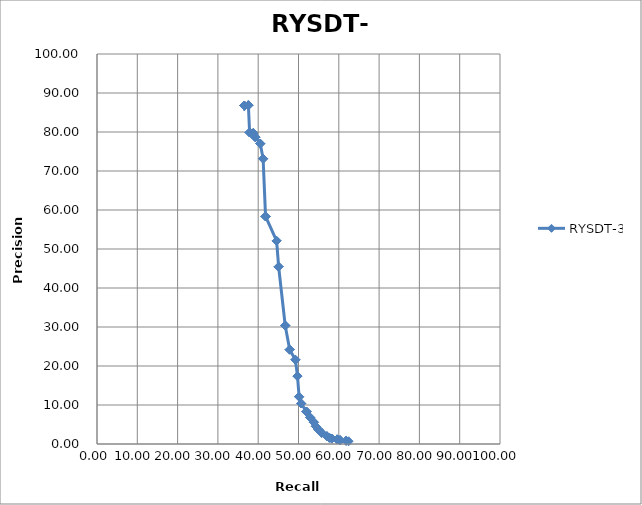
| Category | RYSDT-3 |
|---|---|
| 36.548 | 86.747 |
| 36.548 | 86.747 |
| 36.548 | 86.747 |
| 36.548 | 86.747 |
| 36.548 | 86.747 |
| 36.548 | 86.747 |
| 36.548 | 86.747 |
| 36.548 | 86.747 |
| 36.548 | 86.747 |
| 36.548 | 86.747 |
| 37.563 | 86.854 |
| 37.563 | 86.854 |
| 37.563 | 86.854 |
| 37.563 | 86.854 |
| 37.868 | 79.872 |
| 37.868 | 79.872 |
| 37.868 | 79.872 |
| 38.782 | 79.749 |
| 38.782 | 79.749 |
| 38.782 | 79.749 |
| 39.289 | 78.659 |
| 39.289 | 78.659 |
| 39.289 | 78.659 |
| 39.289 | 78.659 |
| 40.508 | 77.027 |
| 40.508 | 77.027 |
| 40.508 | 77.027 |
| 41.218 | 73.153 |
| 41.218 | 73.153 |
| 41.218 | 73.153 |
| 41.827 | 58.357 |
| 41.827 | 58.357 |
| 41.827 | 58.357 |
| 41.827 | 58.357 |
| 44.569 | 52.076 |
| 44.569 | 52.076 |
| 44.569 | 52.076 |
| 45.076 | 45.445 |
| 45.076 | 45.445 |
| 45.076 | 45.445 |
| 46.701 | 30.383 |
| 46.701 | 30.383 |
| 46.701 | 30.383 |
| 46.701 | 30.383 |
| 47.817 | 24.191 |
| 47.817 | 24.191 |
| 47.817 | 24.191 |
| 49.239 | 21.594 |
| 49.239 | 21.594 |
| 49.239 | 21.594 |
| 49.746 | 17.419 |
| 49.746 | 17.419 |
| 49.746 | 17.419 |
| 49.746 | 17.419 |
| 50.152 | 12.12 |
| 50.152 | 12.12 |
| 50.152 | 12.12 |
| 50.66 | 10.389 |
| 50.66 | 10.389 |
| 50.66 | 10.389 |
| 51.98 | 8.302 |
| 51.98 | 8.302 |
| 51.98 | 8.302 |
| 51.98 | 8.302 |
| 52.893 | 6.792 |
| 52.893 | 6.792 |
| 52.893 | 6.792 |
| 53.807 | 5.595 |
| 53.807 | 5.595 |
| 53.807 | 5.595 |
| 54.315 | 4.516 |
| 54.315 | 4.516 |
| 54.315 | 4.516 |
| 54.315 | 4.516 |
| 54.924 | 3.71 |
| 54.924 | 3.71 |
| 54.924 | 3.71 |
| 55.736 | 2.86 |
| 55.736 | 2.86 |
| 55.736 | 2.86 |
| 57.056 | 1.974 |
| 57.056 | 1.974 |
| 57.056 | 1.974 |
| 57.056 | 1.974 |
| 57.665 | 1.607 |
| 57.665 | 1.607 |
| 57.665 | 1.607 |
| 58.274 | 1.396 |
| 58.274 | 1.396 |
| 58.274 | 1.396 |
| 59.594 | 1.18 |
| 59.594 | 1.18 |
| 59.594 | 1.18 |
| 59.594 | 1.18 |
| 60.305 | 0.987 |
| 60.305 | 0.987 |
| 60.305 | 0.987 |
| 61.827 | 0.838 |
| 61.827 | 0.838 |
| 61.827 | 0.838 |
| 62.437 | 0.704 |